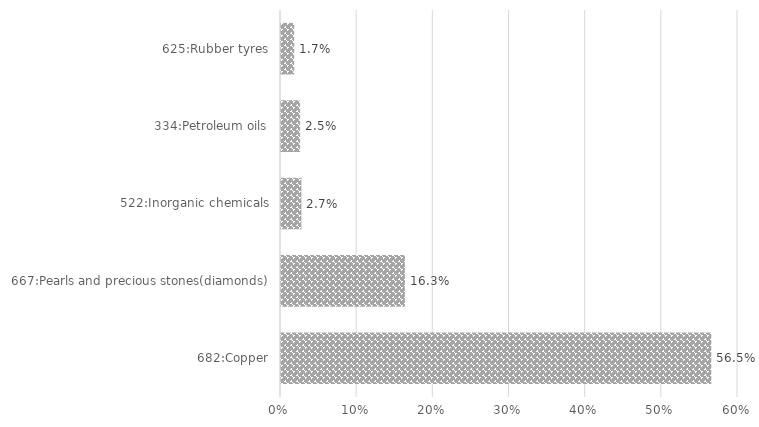
| Category | %Share |
|---|---|
| 682:Copper | 0.565 |
| 667:Pearls and precious stones(diamonds) | 0.163 |
| 522:Inorganic chemicals | 0.027 |
| 334:Petroleum oils | 0.025 |
| 625:Rubber tyres | 0.017 |